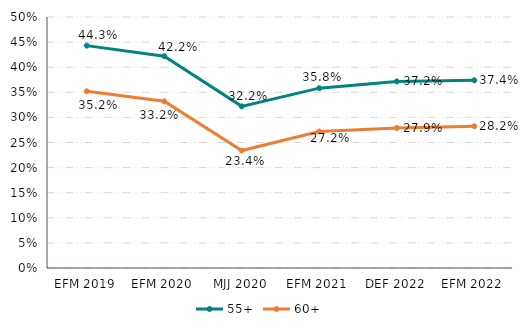
| Category | 55+ | 60+ |
|---|---|---|
| EFM 2019 | 0.443 | 0.352 |
| EFM 2020 | 0.422 | 0.332 |
| MJJ 2020 | 0.322 | 0.234 |
| EFM 2021 | 0.358 | 0.272 |
| DEF 2022 | 0.372 | 0.279 |
| EFM 2022 | 0.374 | 0.282 |